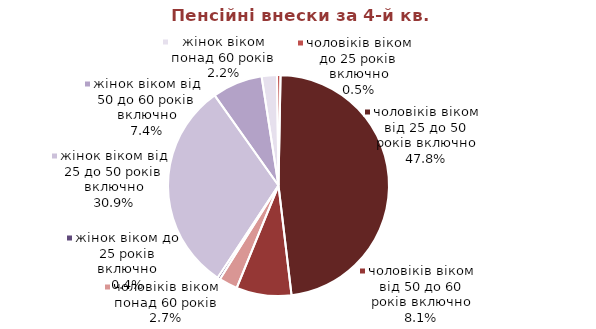
| Category | Series 0 |
|---|---|
| жінок віком до 25 років включно | 0.368 |
| жінок віком від 25 до 50 років включно | 28.873 |
| жінок віком від 50 до 60 років включно | 6.875 |
| жінок віком понад 60 років | 2.079 |
| чоловіків віком до 25 років включно | 0.483 |
| чоловіків віком від 25 до 50 років включно | 44.671 |
| чоловіків віком від 50 до 60 років включно | 7.516 |
| чоловіків віком понад 60 років | 2.546 |